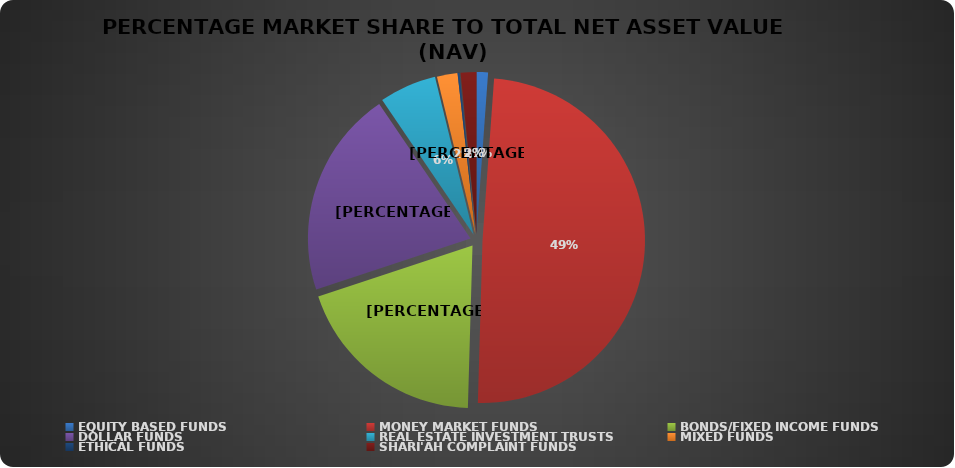
| Category | NET ASSET VALUE |
|---|---|
| EQUITY BASED FUNDS | 18707350348.63 |
| MONEY MARKET FUNDS | 810860786783.25 |
| BONDS/FIXED INCOME FUNDS | 319908980259.002 |
| DOLLAR FUNDS | 338597314330.351 |
| REAL ESTATE INVESTMENT TRUSTS | 93428704507.08 |
| MIXED FUNDS | 33719080186.031 |
| ETHICAL FUNDS | 3226244064.04 |
| SHARI'AH COMPLAINT FUNDS | 25776389309.68 |